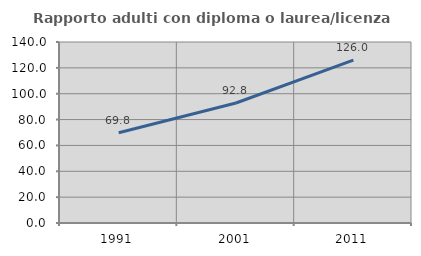
| Category | Rapporto adulti con diploma o laurea/licenza media  |
|---|---|
| 1991.0 | 69.783 |
| 2001.0 | 92.821 |
| 2011.0 | 126.036 |